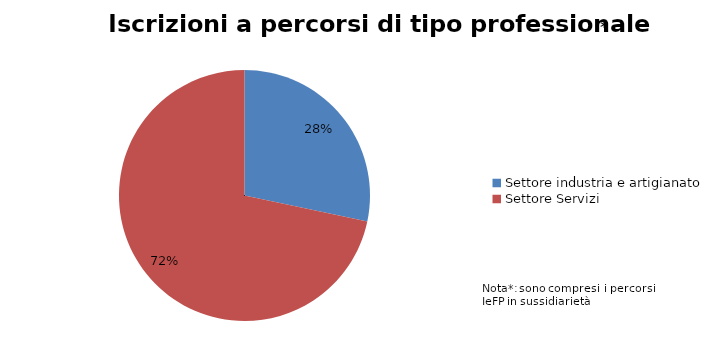
| Category | Series 0 |
|---|---|
| Settore industria e artigianato | 2014 |
| Settore Servizi | 5101 |